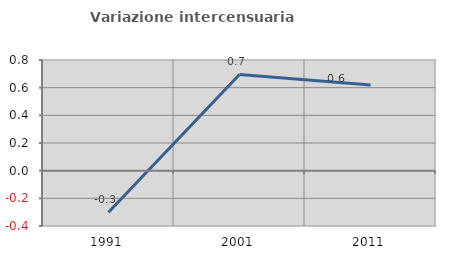
| Category | Variazione intercensuaria annua |
|---|---|
| 1991.0 | -0.301 |
| 2001.0 | 0.695 |
| 2011.0 | 0.619 |